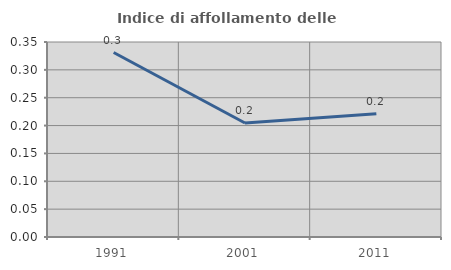
| Category | Indice di affollamento delle abitazioni  |
|---|---|
| 1991.0 | 0.331 |
| 2001.0 | 0.205 |
| 2011.0 | 0.221 |